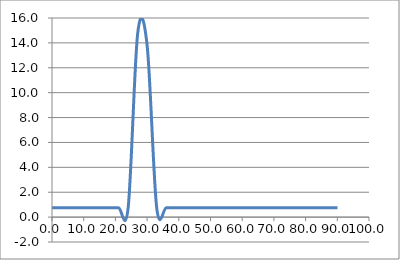
| Category | Elevation (in.) |
|---|---|
| 0.024 | 0.75 |
| 3.024 | 0.75 |
| 6.024 | 0.75 |
| 9.024000000000001 | 0.75 |
| 12.024000000000001 | 0.75 |
| 15.024000000000001 | 0.75 |
| 18.024 | 0.75 |
| 21.024 | 0.75 |
| 24.023999999999997 | 0.75 |
| 27.023999999999997 | 14.75 |
| 30.023999999999997 | 13.75 |
| 33.024 | 0.75 |
| 36.024 | 0.75 |
| 39.024 | 0.75 |
| 42.024 | 0.75 |
| 45.024 | 0.75 |
| 48.024 | 0.75 |
| 51.024 | 0.75 |
| 54.024 | 0.75 |
| 57.024 | 0.75 |
| 60.024 | 0.75 |
| 63.024 | 0.75 |
| 66.024 | 0.75 |
| 69.024 | 0.75 |
| 72.024 | 0.75 |
| 75.024 | 0.75 |
| 78.024 | 0.75 |
| 81.024 | 0.75 |
| 84.024 | 0.75 |
| 87.024 | 0.75 |
| 90.024 | 0.75 |